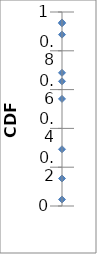
| Category | 0.5 |
|---|---|
| 0.0 | 0.034 |
| 0.0 | 0.292 |
| 0.0 | 0.643 |
| 0.0 | 0.142 |
| 0.0 | 0.942 |
| 0.0 | 0.883 |
| 0.0 | 0.552 |
| 0.0 | 0.687 |
| 0.0 | 0.946 |